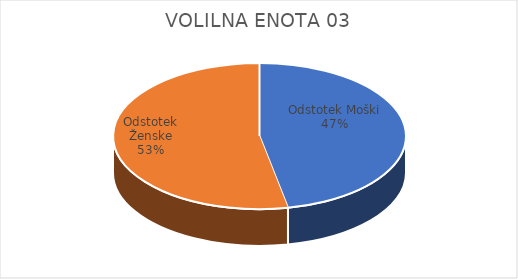
| Category | VOLILNA ENOTA 03 | #REF! | Slovenija skupaj |
|---|---|---|---|
| Odstotek Moški | 15.59 |  | 13.7 |
| Odstotek Ženske | 17.66 |  | 14.52 |